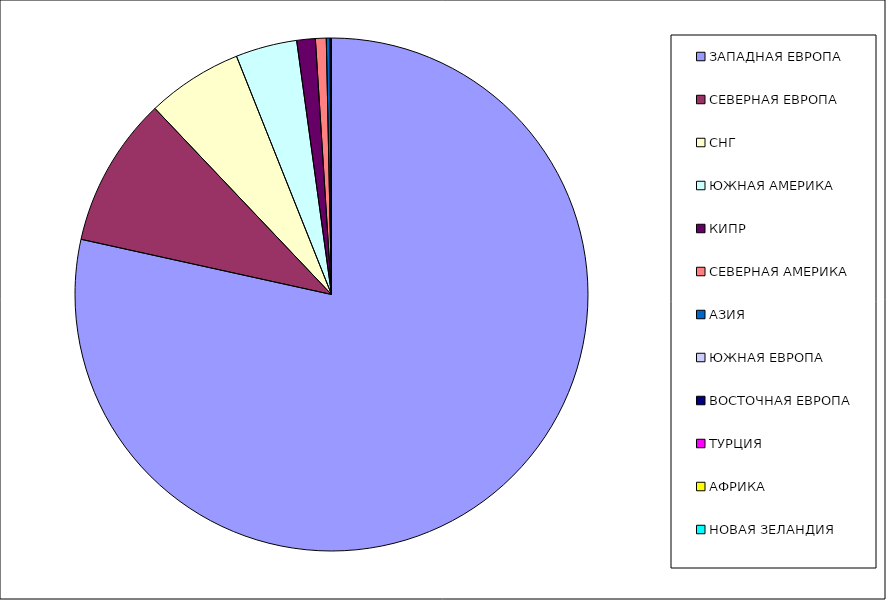
| Category | Оборот |
|---|---|
| ЗАПАДНАЯ ЕВРОПА | 0.785 |
| СЕВЕРНАЯ ЕВРОПА | 0.095 |
| СНГ | 0.06 |
| ЮЖНАЯ АМЕРИКА | 0.039 |
| КИПР | 0.012 |
| СЕВЕРНАЯ АМЕРИКА | 0.007 |
| АЗИЯ | 0.002 |
| ЮЖНАЯ ЕВРОПА | 0.001 |
| ВОСТОЧНАЯ ЕВРОПА | 0 |
| ТУРЦИЯ | 0 |
| АФРИКА | 0 |
| НОВАЯ ЗЕЛАНДИЯ | 0 |